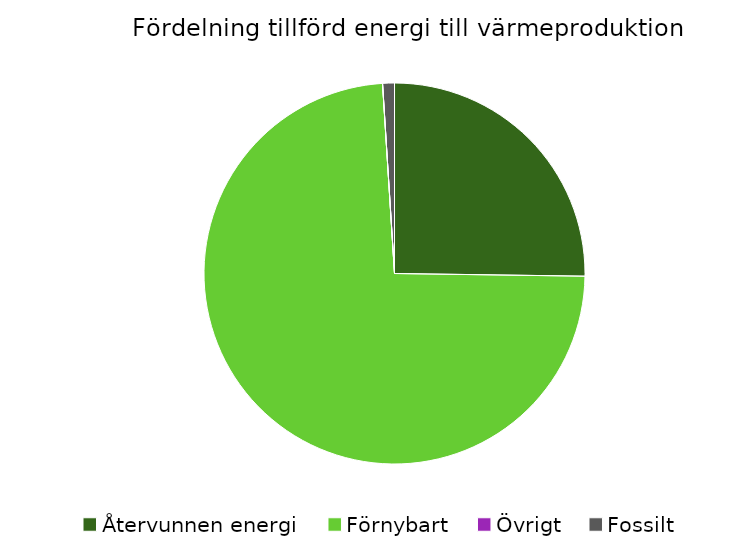
| Category | Fördelning värmeproduktion |
|---|---|
| Återvunnen energi | 0.252 |
| Förnybart | 0.738 |
| Övrigt | 0 |
| Fossilt | 0.01 |